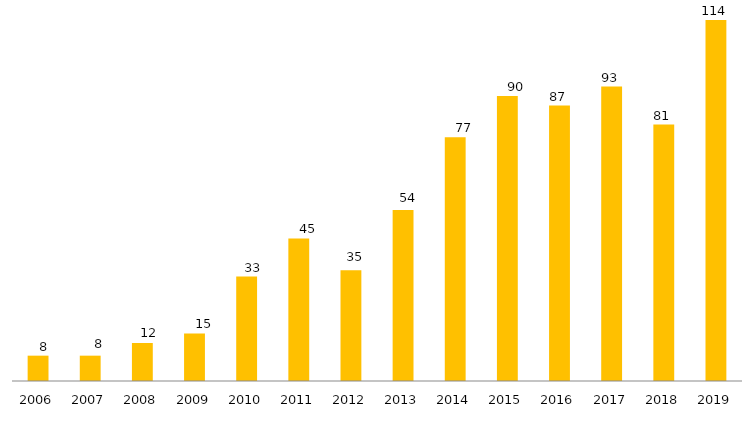
| Category | Programa |
|---|---|
| 2006.0 | 8 |
| 2007.0 | 8 |
| 2008.0 | 12 |
| 2009.0 | 15 |
| 2010.0 | 33 |
| 2011.0 | 45 |
| 2012.0 | 35 |
| 2013.0 | 54 |
| 2014.0 | 77 |
| 2015.0 | 90 |
| 2016.0 | 87 |
| 2017.0 | 93 |
| 2018.0 | 81 |
| 2019.0 | 114 |